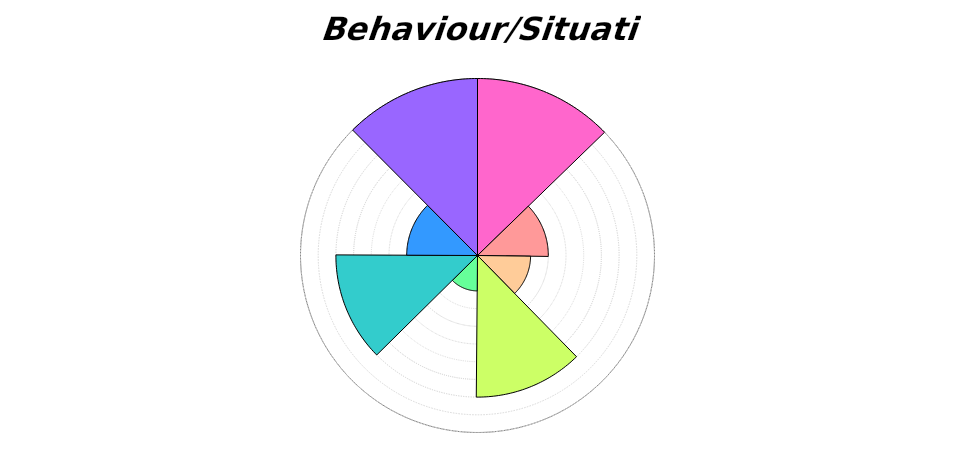
| Category | Frequency | Duration  | Arousal | Context-specificity | Previous experience | Individual differences | Sense of agency | Long-term benefit |
|---|---|---|---|---|---|---|---|---|
| 0 | 10 | 0 | 0 | 0 | 0 | 0 | 0 | 10 |
| 1 | 10 | 0 | 0 | 0 | 0 | 0 | 0 | 0 |
| 2 | 10 | 0 | 0 | 0 | 0 | 0 | 0 | 0 |
| 3 | 10 | 0 | 0 | 0 | 0 | 0 | 0 | 0 |
| 4 | 10 | 0 | 0 | 0 | 0 | 0 | 0 | 0 |
| 5 | 10 | 0 | 0 | 0 | 0 | 0 | 0 | 0 |
| 6 | 10 | 0 | 0 | 0 | 0 | 0 | 0 | 0 |
| 7 | 10 | 0 | 0 | 0 | 0 | 0 | 0 | 0 |
| 8 | 10 | 0 | 0 | 0 | 0 | 0 | 0 | 0 |
| 9 | 10 | 0 | 0 | 0 | 0 | 0 | 0 | 0 |
| 10 | 10 | 0 | 0 | 0 | 0 | 0 | 0 | 0 |
| 11 | 10 | 0 | 0 | 0 | 0 | 0 | 0 | 0 |
| 12 | 10 | 0 | 0 | 0 | 0 | 0 | 0 | 0 |
| 13 | 10 | 0 | 0 | 0 | 0 | 0 | 0 | 0 |
| 14 | 10 | 0 | 0 | 0 | 0 | 0 | 0 | 0 |
| 15 | 10 | 0 | 0 | 0 | 0 | 0 | 0 | 0 |
| 16 | 10 | 0 | 0 | 0 | 0 | 0 | 0 | 0 |
| 17 | 10 | 0 | 0 | 0 | 0 | 0 | 0 | 0 |
| 18 | 10 | 0 | 0 | 0 | 0 | 0 | 0 | 0 |
| 19 | 10 | 0 | 0 | 0 | 0 | 0 | 0 | 0 |
| 20 | 10 | 0 | 0 | 0 | 0 | 0 | 0 | 0 |
| 21 | 10 | 0 | 0 | 0 | 0 | 0 | 0 | 0 |
| 22 | 10 | 0 | 0 | 0 | 0 | 0 | 0 | 0 |
| 23 | 10 | 0 | 0 | 0 | 0 | 0 | 0 | 0 |
| 24 | 10 | 0 | 0 | 0 | 0 | 0 | 0 | 0 |
| 25 | 10 | 0 | 0 | 0 | 0 | 0 | 0 | 0 |
| 26 | 10 | 0 | 0 | 0 | 0 | 0 | 0 | 0 |
| 27 | 10 | 0 | 0 | 0 | 0 | 0 | 0 | 0 |
| 28 | 10 | 0 | 0 | 0 | 0 | 0 | 0 | 0 |
| 29 | 10 | 0 | 0 | 0 | 0 | 0 | 0 | 0 |
| 30 | 10 | 0 | 0 | 0 | 0 | 0 | 0 | 0 |
| 31 | 10 | 0 | 0 | 0 | 0 | 0 | 0 | 0 |
| 32 | 10 | 0 | 0 | 0 | 0 | 0 | 0 | 0 |
| 33 | 10 | 0 | 0 | 0 | 0 | 0 | 0 | 0 |
| 34 | 10 | 0 | 0 | 0 | 0 | 0 | 0 | 0 |
| 35 | 10 | 0 | 0 | 0 | 0 | 0 | 0 | 0 |
| 36 | 10 | 0 | 0 | 0 | 0 | 0 | 0 | 0 |
| 37 | 10 | 0 | 0 | 0 | 0 | 0 | 0 | 0 |
| 38 | 10 | 0 | 0 | 0 | 0 | 0 | 0 | 0 |
| 39 | 10 | 0 | 0 | 0 | 0 | 0 | 0 | 0 |
| 40 | 10 | 0 | 0 | 0 | 0 | 0 | 0 | 0 |
| 41 | 10 | 0 | 0 | 0 | 0 | 0 | 0 | 0 |
| 42 | 10 | 0 | 0 | 0 | 0 | 0 | 0 | 0 |
| 43 | 10 | 0 | 0 | 0 | 0 | 0 | 0 | 0 |
| 44 | 10 | 0 | 0 | 0 | 0 | 0 | 0 | 0 |
| 45 | 10 | 0 | 0 | 0 | 0 | 0 | 0 | 0 |
| 46 | 10 | 4 | 0 | 0 | 0 | 0 | 0 | 0 |
| 47 | 0 | 4 | 0 | 0 | 0 | 0 | 0 | 0 |
| 48 | 0 | 4 | 0 | 0 | 0 | 0 | 0 | 0 |
| 49 | 0 | 4 | 0 | 0 | 0 | 0 | 0 | 0 |
| 50 | 0 | 4 | 0 | 0 | 0 | 0 | 0 | 0 |
| 51 | 0 | 4 | 0 | 0 | 0 | 0 | 0 | 0 |
| 52 | 0 | 4 | 0 | 0 | 0 | 0 | 0 | 0 |
| 53 | 0 | 4 | 0 | 0 | 0 | 0 | 0 | 0 |
| 54 | 0 | 4 | 0 | 0 | 0 | 0 | 0 | 0 |
| 55 | 0 | 4 | 0 | 0 | 0 | 0 | 0 | 0 |
| 56 | 0 | 4 | 0 | 0 | 0 | 0 | 0 | 0 |
| 57 | 0 | 4 | 0 | 0 | 0 | 0 | 0 | 0 |
| 58 | 0 | 4 | 0 | 0 | 0 | 0 | 0 | 0 |
| 59 | 0 | 4 | 0 | 0 | 0 | 0 | 0 | 0 |
| 60 | 0 | 4 | 0 | 0 | 0 | 0 | 0 | 0 |
| 61 | 0 | 4 | 0 | 0 | 0 | 0 | 0 | 0 |
| 62 | 0 | 4 | 0 | 0 | 0 | 0 | 0 | 0 |
| 63 | 0 | 4 | 0 | 0 | 0 | 0 | 0 | 0 |
| 64 | 0 | 4 | 0 | 0 | 0 | 0 | 0 | 0 |
| 65 | 0 | 4 | 0 | 0 | 0 | 0 | 0 | 0 |
| 66 | 0 | 4 | 0 | 0 | 0 | 0 | 0 | 0 |
| 67 | 0 | 4 | 0 | 0 | 0 | 0 | 0 | 0 |
| 68 | 0 | 4 | 0 | 0 | 0 | 0 | 0 | 0 |
| 69 | 0 | 4 | 0 | 0 | 0 | 0 | 0 | 0 |
| 70 | 0 | 4 | 0 | 0 | 0 | 0 | 0 | 0 |
| 71 | 0 | 4 | 0 | 0 | 0 | 0 | 0 | 0 |
| 72 | 0 | 4 | 0 | 0 | 0 | 0 | 0 | 0 |
| 73 | 0 | 4 | 0 | 0 | 0 | 0 | 0 | 0 |
| 74 | 0 | 4 | 0 | 0 | 0 | 0 | 0 | 0 |
| 75 | 0 | 4 | 0 | 0 | 0 | 0 | 0 | 0 |
| 76 | 0 | 4 | 0 | 0 | 0 | 0 | 0 | 0 |
| 77 | 0 | 4 | 0 | 0 | 0 | 0 | 0 | 0 |
| 78 | 0 | 4 | 0 | 0 | 0 | 0 | 0 | 0 |
| 79 | 0 | 4 | 0 | 0 | 0 | 0 | 0 | 0 |
| 80 | 0 | 4 | 0 | 0 | 0 | 0 | 0 | 0 |
| 81 | 0 | 4 | 0 | 0 | 0 | 0 | 0 | 0 |
| 82 | 0 | 4 | 0 | 0 | 0 | 0 | 0 | 0 |
| 83 | 0 | 4 | 0 | 0 | 0 | 0 | 0 | 0 |
| 84 | 0 | 4 | 0 | 0 | 0 | 0 | 0 | 0 |
| 85 | 0 | 4 | 0 | 0 | 0 | 0 | 0 | 0 |
| 86 | 0 | 4 | 0 | 0 | 0 | 0 | 0 | 0 |
| 87 | 0 | 4 | 0 | 0 | 0 | 0 | 0 | 0 |
| 88 | 0 | 4 | 0 | 0 | 0 | 0 | 0 | 0 |
| 89 | 0 | 4 | 0 | 0 | 0 | 0 | 0 | 0 |
| 90 | 0 | 4 | 0 | 0 | 0 | 0 | 0 | 0 |
| 91 | 0 | 4 | 3 | 0 | 0 | 0 | 0 | 0 |
| 92 | 0 | 0 | 3 | 0 | 0 | 0 | 0 | 0 |
| 93 | 0 | 0 | 3 | 0 | 0 | 0 | 0 | 0 |
| 94 | 0 | 0 | 3 | 0 | 0 | 0 | 0 | 0 |
| 95 | 0 | 0 | 3 | 0 | 0 | 0 | 0 | 0 |
| 96 | 0 | 0 | 3 | 0 | 0 | 0 | 0 | 0 |
| 97 | 0 | 0 | 3 | 0 | 0 | 0 | 0 | 0 |
| 98 | 0 | 0 | 3 | 0 | 0 | 0 | 0 | 0 |
| 99 | 0 | 0 | 3 | 0 | 0 | 0 | 0 | 0 |
| 100 | 0 | 0 | 3 | 0 | 0 | 0 | 0 | 0 |
| 101 | 0 | 0 | 3 | 0 | 0 | 0 | 0 | 0 |
| 102 | 0 | 0 | 3 | 0 | 0 | 0 | 0 | 0 |
| 103 | 0 | 0 | 3 | 0 | 0 | 0 | 0 | 0 |
| 104 | 0 | 0 | 3 | 0 | 0 | 0 | 0 | 0 |
| 105 | 0 | 0 | 3 | 0 | 0 | 0 | 0 | 0 |
| 106 | 0 | 0 | 3 | 0 | 0 | 0 | 0 | 0 |
| 107 | 0 | 0 | 3 | 0 | 0 | 0 | 0 | 0 |
| 108 | 0 | 0 | 3 | 0 | 0 | 0 | 0 | 0 |
| 109 | 0 | 0 | 3 | 0 | 0 | 0 | 0 | 0 |
| 110 | 0 | 0 | 3 | 0 | 0 | 0 | 0 | 0 |
| 111 | 0 | 0 | 3 | 0 | 0 | 0 | 0 | 0 |
| 112 | 0 | 0 | 3 | 0 | 0 | 0 | 0 | 0 |
| 113 | 0 | 0 | 3 | 0 | 0 | 0 | 0 | 0 |
| 114 | 0 | 0 | 3 | 0 | 0 | 0 | 0 | 0 |
| 115 | 0 | 0 | 3 | 0 | 0 | 0 | 0 | 0 |
| 116 | 0 | 0 | 3 | 0 | 0 | 0 | 0 | 0 |
| 117 | 0 | 0 | 3 | 0 | 0 | 0 | 0 | 0 |
| 118 | 0 | 0 | 3 | 0 | 0 | 0 | 0 | 0 |
| 119 | 0 | 0 | 3 | 0 | 0 | 0 | 0 | 0 |
| 120 | 0 | 0 | 3 | 0 | 0 | 0 | 0 | 0 |
| 121 | 0 | 0 | 3 | 0 | 0 | 0 | 0 | 0 |
| 122 | 0 | 0 | 3 | 0 | 0 | 0 | 0 | 0 |
| 123 | 0 | 0 | 3 | 0 | 0 | 0 | 0 | 0 |
| 124 | 0 | 0 | 3 | 0 | 0 | 0 | 0 | 0 |
| 125 | 0 | 0 | 3 | 0 | 0 | 0 | 0 | 0 |
| 126 | 0 | 0 | 3 | 0 | 0 | 0 | 0 | 0 |
| 127 | 0 | 0 | 3 | 0 | 0 | 0 | 0 | 0 |
| 128 | 0 | 0 | 3 | 0 | 0 | 0 | 0 | 0 |
| 129 | 0 | 0 | 3 | 0 | 0 | 0 | 0 | 0 |
| 130 | 0 | 0 | 3 | 0 | 0 | 0 | 0 | 0 |
| 131 | 0 | 0 | 3 | 0 | 0 | 0 | 0 | 0 |
| 132 | 0 | 0 | 3 | 0 | 0 | 0 | 0 | 0 |
| 133 | 0 | 0 | 3 | 0 | 0 | 0 | 0 | 0 |
| 134 | 0 | 0 | 3 | 0 | 0 | 0 | 0 | 0 |
| 135 | 0 | 0 | 3 | 0 | 0 | 0 | 0 | 0 |
| 136 | 0 | 0 | 3 | 8 | 0 | 0 | 0 | 0 |
| 137 | 0 | 0 | 0 | 8 | 0 | 0 | 0 | 0 |
| 138 | 0 | 0 | 0 | 8 | 0 | 0 | 0 | 0 |
| 139 | 0 | 0 | 0 | 8 | 0 | 0 | 0 | 0 |
| 140 | 0 | 0 | 0 | 8 | 0 | 0 | 0 | 0 |
| 141 | 0 | 0 | 0 | 8 | 0 | 0 | 0 | 0 |
| 142 | 0 | 0 | 0 | 8 | 0 | 0 | 0 | 0 |
| 143 | 0 | 0 | 0 | 8 | 0 | 0 | 0 | 0 |
| 144 | 0 | 0 | 0 | 8 | 0 | 0 | 0 | 0 |
| 145 | 0 | 0 | 0 | 8 | 0 | 0 | 0 | 0 |
| 146 | 0 | 0 | 0 | 8 | 0 | 0 | 0 | 0 |
| 147 | 0 | 0 | 0 | 8 | 0 | 0 | 0 | 0 |
| 148 | 0 | 0 | 0 | 8 | 0 | 0 | 0 | 0 |
| 149 | 0 | 0 | 0 | 8 | 0 | 0 | 0 | 0 |
| 150 | 0 | 0 | 0 | 8 | 0 | 0 | 0 | 0 |
| 151 | 0 | 0 | 0 | 8 | 0 | 0 | 0 | 0 |
| 152 | 0 | 0 | 0 | 8 | 0 | 0 | 0 | 0 |
| 153 | 0 | 0 | 0 | 8 | 0 | 0 | 0 | 0 |
| 154 | 0 | 0 | 0 | 8 | 0 | 0 | 0 | 0 |
| 155 | 0 | 0 | 0 | 8 | 0 | 0 | 0 | 0 |
| 156 | 0 | 0 | 0 | 8 | 0 | 0 | 0 | 0 |
| 157 | 0 | 0 | 0 | 8 | 0 | 0 | 0 | 0 |
| 158 | 0 | 0 | 0 | 8 | 0 | 0 | 0 | 0 |
| 159 | 0 | 0 | 0 | 8 | 0 | 0 | 0 | 0 |
| 160 | 0 | 0 | 0 | 8 | 0 | 0 | 0 | 0 |
| 161 | 0 | 0 | 0 | 8 | 0 | 0 | 0 | 0 |
| 162 | 0 | 0 | 0 | 8 | 0 | 0 | 0 | 0 |
| 163 | 0 | 0 | 0 | 8 | 0 | 0 | 0 | 0 |
| 164 | 0 | 0 | 0 | 8 | 0 | 0 | 0 | 0 |
| 165 | 0 | 0 | 0 | 8 | 0 | 0 | 0 | 0 |
| 166 | 0 | 0 | 0 | 8 | 0 | 0 | 0 | 0 |
| 167 | 0 | 0 | 0 | 8 | 0 | 0 | 0 | 0 |
| 168 | 0 | 0 | 0 | 8 | 0 | 0 | 0 | 0 |
| 169 | 0 | 0 | 0 | 8 | 0 | 0 | 0 | 0 |
| 170 | 0 | 0 | 0 | 8 | 0 | 0 | 0 | 0 |
| 171 | 0 | 0 | 0 | 8 | 0 | 0 | 0 | 0 |
| 172 | 0 | 0 | 0 | 8 | 0 | 0 | 0 | 0 |
| 173 | 0 | 0 | 0 | 8 | 0 | 0 | 0 | 0 |
| 174 | 0 | 0 | 0 | 8 | 0 | 0 | 0 | 0 |
| 175 | 0 | 0 | 0 | 8 | 0 | 0 | 0 | 0 |
| 176 | 0 | 0 | 0 | 8 | 0 | 0 | 0 | 0 |
| 177 | 0 | 0 | 0 | 8 | 0 | 0 | 0 | 0 |
| 178 | 0 | 0 | 0 | 8 | 0 | 0 | 0 | 0 |
| 179 | 0 | 0 | 0 | 8 | 0 | 0 | 0 | 0 |
| 180 | 0 | 0 | 0 | 8 | 0 | 0 | 0 | 0 |
| 181 | 0 | 0 | 0 | 8 | 2 | 0 | 0 | 0 |
| 182 | 0 | 0 | 0 | 0 | 2 | 0 | 0 | 0 |
| 183 | 0 | 0 | 0 | 0 | 2 | 0 | 0 | 0 |
| 184 | 0 | 0 | 0 | 0 | 2 | 0 | 0 | 0 |
| 185 | 0 | 0 | 0 | 0 | 2 | 0 | 0 | 0 |
| 186 | 0 | 0 | 0 | 0 | 2 | 0 | 0 | 0 |
| 187 | 0 | 0 | 0 | 0 | 2 | 0 | 0 | 0 |
| 188 | 0 | 0 | 0 | 0 | 2 | 0 | 0 | 0 |
| 189 | 0 | 0 | 0 | 0 | 2 | 0 | 0 | 0 |
| 190 | 0 | 0 | 0 | 0 | 2 | 0 | 0 | 0 |
| 191 | 0 | 0 | 0 | 0 | 2 | 0 | 0 | 0 |
| 192 | 0 | 0 | 0 | 0 | 2 | 0 | 0 | 0 |
| 193 | 0 | 0 | 0 | 0 | 2 | 0 | 0 | 0 |
| 194 | 0 | 0 | 0 | 0 | 2 | 0 | 0 | 0 |
| 195 | 0 | 0 | 0 | 0 | 2 | 0 | 0 | 0 |
| 196 | 0 | 0 | 0 | 0 | 2 | 0 | 0 | 0 |
| 197 | 0 | 0 | 0 | 0 | 2 | 0 | 0 | 0 |
| 198 | 0 | 0 | 0 | 0 | 2 | 0 | 0 | 0 |
| 199 | 0 | 0 | 0 | 0 | 2 | 0 | 0 | 0 |
| 200 | 0 | 0 | 0 | 0 | 2 | 0 | 0 | 0 |
| 201 | 0 | 0 | 0 | 0 | 2 | 0 | 0 | 0 |
| 202 | 0 | 0 | 0 | 0 | 2 | 0 | 0 | 0 |
| 203 | 0 | 0 | 0 | 0 | 2 | 0 | 0 | 0 |
| 204 | 0 | 0 | 0 | 0 | 2 | 0 | 0 | 0 |
| 205 | 0 | 0 | 0 | 0 | 2 | 0 | 0 | 0 |
| 206 | 0 | 0 | 0 | 0 | 2 | 0 | 0 | 0 |
| 207 | 0 | 0 | 0 | 0 | 2 | 0 | 0 | 0 |
| 208 | 0 | 0 | 0 | 0 | 2 | 0 | 0 | 0 |
| 209 | 0 | 0 | 0 | 0 | 2 | 0 | 0 | 0 |
| 210 | 0 | 0 | 0 | 0 | 2 | 0 | 0 | 0 |
| 211 | 0 | 0 | 0 | 0 | 2 | 0 | 0 | 0 |
| 212 | 0 | 0 | 0 | 0 | 2 | 0 | 0 | 0 |
| 213 | 0 | 0 | 0 | 0 | 2 | 0 | 0 | 0 |
| 214 | 0 | 0 | 0 | 0 | 2 | 0 | 0 | 0 |
| 215 | 0 | 0 | 0 | 0 | 2 | 0 | 0 | 0 |
| 216 | 0 | 0 | 0 | 0 | 2 | 0 | 0 | 0 |
| 217 | 0 | 0 | 0 | 0 | 2 | 0 | 0 | 0 |
| 218 | 0 | 0 | 0 | 0 | 2 | 0 | 0 | 0 |
| 219 | 0 | 0 | 0 | 0 | 2 | 0 | 0 | 0 |
| 220 | 0 | 0 | 0 | 0 | 2 | 0 | 0 | 0 |
| 221 | 0 | 0 | 0 | 0 | 2 | 0 | 0 | 0 |
| 222 | 0 | 0 | 0 | 0 | 2 | 0 | 0 | 0 |
| 223 | 0 | 0 | 0 | 0 | 2 | 0 | 0 | 0 |
| 224 | 0 | 0 | 0 | 0 | 2 | 0 | 0 | 0 |
| 225 | 0 | 0 | 0 | 0 | 2 | 0 | 0 | 0 |
| 226 | 0 | 0 | 0 | 0 | 2 | 8 | 0 | 0 |
| 227 | 0 | 0 | 0 | 0 | 0 | 8 | 0 | 0 |
| 228 | 0 | 0 | 0 | 0 | 0 | 8 | 0 | 0 |
| 229 | 0 | 0 | 0 | 0 | 0 | 8 | 0 | 0 |
| 230 | 0 | 0 | 0 | 0 | 0 | 8 | 0 | 0 |
| 231 | 0 | 0 | 0 | 0 | 0 | 8 | 0 | 0 |
| 232 | 0 | 0 | 0 | 0 | 0 | 8 | 0 | 0 |
| 233 | 0 | 0 | 0 | 0 | 0 | 8 | 0 | 0 |
| 234 | 0 | 0 | 0 | 0 | 0 | 8 | 0 | 0 |
| 235 | 0 | 0 | 0 | 0 | 0 | 8 | 0 | 0 |
| 236 | 0 | 0 | 0 | 0 | 0 | 8 | 0 | 0 |
| 237 | 0 | 0 | 0 | 0 | 0 | 8 | 0 | 0 |
| 238 | 0 | 0 | 0 | 0 | 0 | 8 | 0 | 0 |
| 239 | 0 | 0 | 0 | 0 | 0 | 8 | 0 | 0 |
| 240 | 0 | 0 | 0 | 0 | 0 | 8 | 0 | 0 |
| 241 | 0 | 0 | 0 | 0 | 0 | 8 | 0 | 0 |
| 242 | 0 | 0 | 0 | 0 | 0 | 8 | 0 | 0 |
| 243 | 0 | 0 | 0 | 0 | 0 | 8 | 0 | 0 |
| 244 | 0 | 0 | 0 | 0 | 0 | 8 | 0 | 0 |
| 245 | 0 | 0 | 0 | 0 | 0 | 8 | 0 | 0 |
| 246 | 0 | 0 | 0 | 0 | 0 | 8 | 0 | 0 |
| 247 | 0 | 0 | 0 | 0 | 0 | 8 | 0 | 0 |
| 248 | 0 | 0 | 0 | 0 | 0 | 8 | 0 | 0 |
| 249 | 0 | 0 | 0 | 0 | 0 | 8 | 0 | 0 |
| 250 | 0 | 0 | 0 | 0 | 0 | 8 | 0 | 0 |
| 251 | 0 | 0 | 0 | 0 | 0 | 8 | 0 | 0 |
| 252 | 0 | 0 | 0 | 0 | 0 | 8 | 0 | 0 |
| 253 | 0 | 0 | 0 | 0 | 0 | 8 | 0 | 0 |
| 254 | 0 | 0 | 0 | 0 | 0 | 8 | 0 | 0 |
| 255 | 0 | 0 | 0 | 0 | 0 | 8 | 0 | 0 |
| 256 | 0 | 0 | 0 | 0 | 0 | 8 | 0 | 0 |
| 257 | 0 | 0 | 0 | 0 | 0 | 8 | 0 | 0 |
| 258 | 0 | 0 | 0 | 0 | 0 | 8 | 0 | 0 |
| 259 | 0 | 0 | 0 | 0 | 0 | 8 | 0 | 0 |
| 260 | 0 | 0 | 0 | 0 | 0 | 8 | 0 | 0 |
| 261 | 0 | 0 | 0 | 0 | 0 | 8 | 0 | 0 |
| 262 | 0 | 0 | 0 | 0 | 0 | 8 | 0 | 0 |
| 263 | 0 | 0 | 0 | 0 | 0 | 8 | 0 | 0 |
| 264 | 0 | 0 | 0 | 0 | 0 | 8 | 0 | 0 |
| 265 | 0 | 0 | 0 | 0 | 0 | 8 | 0 | 0 |
| 266 | 0 | 0 | 0 | 0 | 0 | 8 | 0 | 0 |
| 267 | 0 | 0 | 0 | 0 | 0 | 8 | 0 | 0 |
| 268 | 0 | 0 | 0 | 0 | 0 | 8 | 0 | 0 |
| 269 | 0 | 0 | 0 | 0 | 0 | 8 | 0 | 0 |
| 270 | 0 | 0 | 0 | 0 | 0 | 8 | 0 | 0 |
| 271 | 0 | 0 | 0 | 0 | 0 | 8 | 4 | 0 |
| 272 | 0 | 0 | 0 | 0 | 0 | 0 | 4 | 0 |
| 273 | 0 | 0 | 0 | 0 | 0 | 0 | 4 | 0 |
| 274 | 0 | 0 | 0 | 0 | 0 | 0 | 4 | 0 |
| 275 | 0 | 0 | 0 | 0 | 0 | 0 | 4 | 0 |
| 276 | 0 | 0 | 0 | 0 | 0 | 0 | 4 | 0 |
| 277 | 0 | 0 | 0 | 0 | 0 | 0 | 4 | 0 |
| 278 | 0 | 0 | 0 | 0 | 0 | 0 | 4 | 0 |
| 279 | 0 | 0 | 0 | 0 | 0 | 0 | 4 | 0 |
| 280 | 0 | 0 | 0 | 0 | 0 | 0 | 4 | 0 |
| 281 | 0 | 0 | 0 | 0 | 0 | 0 | 4 | 0 |
| 282 | 0 | 0 | 0 | 0 | 0 | 0 | 4 | 0 |
| 283 | 0 | 0 | 0 | 0 | 0 | 0 | 4 | 0 |
| 284 | 0 | 0 | 0 | 0 | 0 | 0 | 4 | 0 |
| 285 | 0 | 0 | 0 | 0 | 0 | 0 | 4 | 0 |
| 286 | 0 | 0 | 0 | 0 | 0 | 0 | 4 | 0 |
| 287 | 0 | 0 | 0 | 0 | 0 | 0 | 4 | 0 |
| 288 | 0 | 0 | 0 | 0 | 0 | 0 | 4 | 0 |
| 289 | 0 | 0 | 0 | 0 | 0 | 0 | 4 | 0 |
| 290 | 0 | 0 | 0 | 0 | 0 | 0 | 4 | 0 |
| 291 | 0 | 0 | 0 | 0 | 0 | 0 | 4 | 0 |
| 292 | 0 | 0 | 0 | 0 | 0 | 0 | 4 | 0 |
| 293 | 0 | 0 | 0 | 0 | 0 | 0 | 4 | 0 |
| 294 | 0 | 0 | 0 | 0 | 0 | 0 | 4 | 0 |
| 295 | 0 | 0 | 0 | 0 | 0 | 0 | 4 | 0 |
| 296 | 0 | 0 | 0 | 0 | 0 | 0 | 4 | 0 |
| 297 | 0 | 0 | 0 | 0 | 0 | 0 | 4 | 0 |
| 298 | 0 | 0 | 0 | 0 | 0 | 0 | 4 | 0 |
| 299 | 0 | 0 | 0 | 0 | 0 | 0 | 4 | 0 |
| 300 | 0 | 0 | 0 | 0 | 0 | 0 | 4 | 0 |
| 301 | 0 | 0 | 0 | 0 | 0 | 0 | 4 | 0 |
| 302 | 0 | 0 | 0 | 0 | 0 | 0 | 4 | 0 |
| 303 | 0 | 0 | 0 | 0 | 0 | 0 | 4 | 0 |
| 304 | 0 | 0 | 0 | 0 | 0 | 0 | 4 | 0 |
| 305 | 0 | 0 | 0 | 0 | 0 | 0 | 4 | 0 |
| 306 | 0 | 0 | 0 | 0 | 0 | 0 | 4 | 0 |
| 307 | 0 | 0 | 0 | 0 | 0 | 0 | 4 | 0 |
| 308 | 0 | 0 | 0 | 0 | 0 | 0 | 4 | 0 |
| 309 | 0 | 0 | 0 | 0 | 0 | 0 | 4 | 0 |
| 310 | 0 | 0 | 0 | 0 | 0 | 0 | 4 | 0 |
| 311 | 0 | 0 | 0 | 0 | 0 | 0 | 4 | 0 |
| 312 | 0 | 0 | 0 | 0 | 0 | 0 | 4 | 0 |
| 313 | 0 | 0 | 0 | 0 | 0 | 0 | 4 | 0 |
| 314 | 0 | 0 | 0 | 0 | 0 | 0 | 4 | 0 |
| 315 | 0 | 0 | 0 | 0 | 0 | 0 | 4 | 0 |
| 316 | 0 | 0 | 0 | 0 | 0 | 0 | 4 | 10 |
| 317 | 0 | 0 | 0 | 0 | 0 | 0 | 0 | 10 |
| 318 | 0 | 0 | 0 | 0 | 0 | 0 | 0 | 10 |
| 319 | 0 | 0 | 0 | 0 | 0 | 0 | 0 | 10 |
| 320 | 0 | 0 | 0 | 0 | 0 | 0 | 0 | 10 |
| 321 | 0 | 0 | 0 | 0 | 0 | 0 | 0 | 10 |
| 322 | 0 | 0 | 0 | 0 | 0 | 0 | 0 | 10 |
| 323 | 0 | 0 | 0 | 0 | 0 | 0 | 0 | 10 |
| 324 | 0 | 0 | 0 | 0 | 0 | 0 | 0 | 10 |
| 325 | 0 | 0 | 0 | 0 | 0 | 0 | 0 | 10 |
| 326 | 0 | 0 | 0 | 0 | 0 | 0 | 0 | 10 |
| 327 | 0 | 0 | 0 | 0 | 0 | 0 | 0 | 10 |
| 328 | 0 | 0 | 0 | 0 | 0 | 0 | 0 | 10 |
| 329 | 0 | 0 | 0 | 0 | 0 | 0 | 0 | 10 |
| 330 | 0 | 0 | 0 | 0 | 0 | 0 | 0 | 10 |
| 331 | 0 | 0 | 0 | 0 | 0 | 0 | 0 | 10 |
| 332 | 0 | 0 | 0 | 0 | 0 | 0 | 0 | 10 |
| 333 | 0 | 0 | 0 | 0 | 0 | 0 | 0 | 10 |
| 334 | 0 | 0 | 0 | 0 | 0 | 0 | 0 | 10 |
| 335 | 0 | 0 | 0 | 0 | 0 | 0 | 0 | 10 |
| 336 | 0 | 0 | 0 | 0 | 0 | 0 | 0 | 10 |
| 337 | 0 | 0 | 0 | 0 | 0 | 0 | 0 | 10 |
| 338 | 0 | 0 | 0 | 0 | 0 | 0 | 0 | 10 |
| 339 | 0 | 0 | 0 | 0 | 0 | 0 | 0 | 10 |
| 340 | 0 | 0 | 0 | 0 | 0 | 0 | 0 | 10 |
| 341 | 0 | 0 | 0 | 0 | 0 | 0 | 0 | 10 |
| 342 | 0 | 0 | 0 | 0 | 0 | 0 | 0 | 10 |
| 343 | 0 | 0 | 0 | 0 | 0 | 0 | 0 | 10 |
| 344 | 0 | 0 | 0 | 0 | 0 | 0 | 0 | 10 |
| 345 | 0 | 0 | 0 | 0 | 0 | 0 | 0 | 10 |
| 346 | 0 | 0 | 0 | 0 | 0 | 0 | 0 | 10 |
| 347 | 0 | 0 | 0 | 0 | 0 | 0 | 0 | 10 |
| 348 | 0 | 0 | 0 | 0 | 0 | 0 | 0 | 10 |
| 349 | 0 | 0 | 0 | 0 | 0 | 0 | 0 | 10 |
| 350 | 0 | 0 | 0 | 0 | 0 | 0 | 0 | 10 |
| 351 | 0 | 0 | 0 | 0 | 0 | 0 | 0 | 10 |
| 352 | 0 | 0 | 0 | 0 | 0 | 0 | 0 | 10 |
| 353 | 0 | 0 | 0 | 0 | 0 | 0 | 0 | 10 |
| 354 | 0 | 0 | 0 | 0 | 0 | 0 | 0 | 10 |
| 355 | 0 | 0 | 0 | 0 | 0 | 0 | 0 | 10 |
| 356 | 0 | 0 | 0 | 0 | 0 | 0 | 0 | 10 |
| 357 | 0 | 0 | 0 | 0 | 0 | 0 | 0 | 10 |
| 358 | 0 | 0 | 0 | 0 | 0 | 0 | 0 | 10 |
| 359 | 0 | 0 | 0 | 0 | 0 | 0 | 0 | 10 |
| 360 | 0 | 0 | 0 | 0 | 0 | 0 | 0 | 10 |